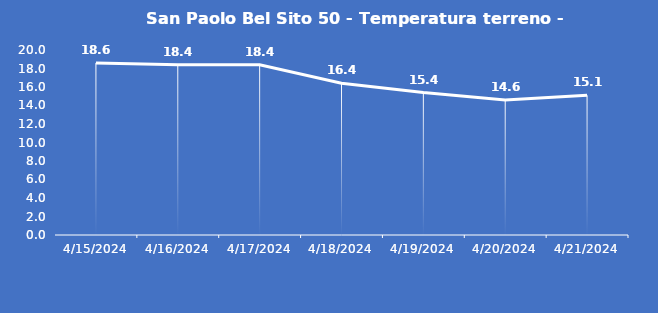
| Category | San Paolo Bel Sito 50 - Temperatura terreno - Grezzo (°C) |
|---|---|
| 4/15/24 | 18.6 |
| 4/16/24 | 18.4 |
| 4/17/24 | 18.4 |
| 4/18/24 | 16.4 |
| 4/19/24 | 15.4 |
| 4/20/24 | 14.6 |
| 4/21/24 | 15.1 |